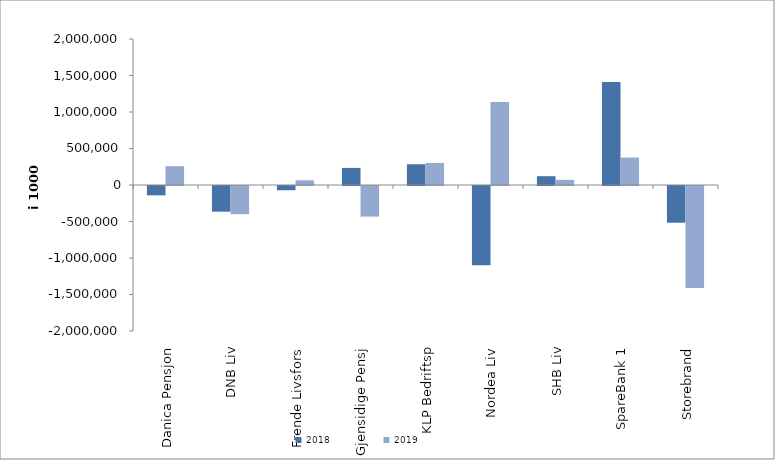
| Category | 2018 | 2019 |
|---|---|---|
| Danica Pensjon | -127938.384 | 257596.996 |
| DNB Liv | -351863 | -385535.373 |
| Frende Livsfors | -57824.5 | 64171 |
| Gjensidige Pensj | 234150 | -419270 |
| KLP Bedriftsp | 284074 | 302024 |
| Nordea Liv | -1085791.441 | 1135836.201 |
| SHB Liv | 120585 | 70450.499 |
| SpareBank 1 | 1410787.064 | 375750.191 |
| Storebrand | -503303.253 | -1397198.817 |